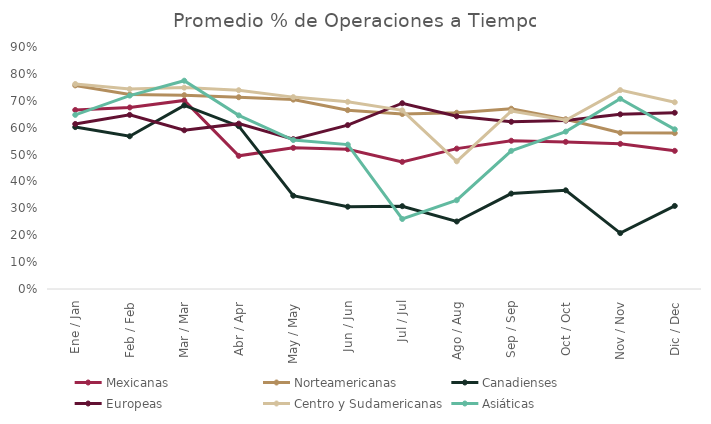
| Category | Mexicanas | Norteamericanas | Canadienses | Europeas | Centro y Sudamericanas | Asiáticas |
|---|---|---|---|---|---|---|
| Ene / Jan | 0.666 | 0.757 | 0.602 | 0.614 | 0.762 | 0.648 |
| Feb / Feb | 0.675 | 0.723 | 0.568 | 0.648 | 0.743 | 0.719 |
| Mar / Mar | 0.701 | 0.721 | 0.683 | 0.59 | 0.749 | 0.775 |
| Abr / Apr | 0.495 | 0.713 | 0.606 | 0.615 | 0.739 | 0.646 |
| May / May | 0.525 | 0.704 | 0.347 | 0.557 | 0.714 | 0.554 |
| Jun / Jun | 0.52 | 0.665 | 0.306 | 0.61 | 0.696 | 0.537 |
| Jul / Jul | 0.473 | 0.651 | 0.308 | 0.691 | 0.664 | 0.26 |
| Ago / Aug | 0.522 | 0.656 | 0.251 | 0.642 | 0.475 | 0.33 |
| Sep / Sep | 0.551 | 0.671 | 0.355 | 0.622 | 0.662 | 0.514 |
| Oct / Oct | 0.547 | 0.631 | 0.367 | 0.626 | 0.628 | 0.585 |
| Nov / Nov | 0.54 | 0.581 | 0.208 | 0.65 | 0.74 | 0.707 |
| Dic / Dec | 0.514 | 0.58 | 0.309 | 0.656 | 0.694 | 0.594 |